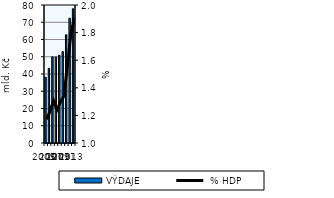
| Category | VÝDAJE |
|---|---|
| 2005.0 | 38.146 |
| 2006.0 | 43.268 |
| 2007.0 | 50.009 |
| 2008.0 | 49.872 |
| 2009.0 | 50.875 |
| 2010.0 | 52.974 |
| 2011.0 | 62.753 |
| 2012.0 | 72.36 |
| 2013.0 | 77.839 |